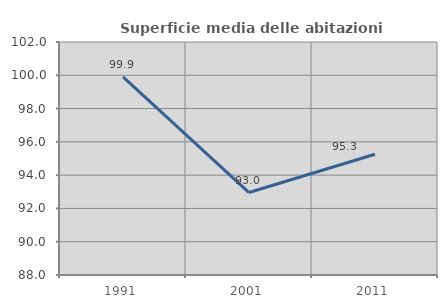
| Category | Superficie media delle abitazioni occupate |
|---|---|
| 1991.0 | 99.903 |
| 2001.0 | 92.953 |
| 2011.0 | 95.255 |